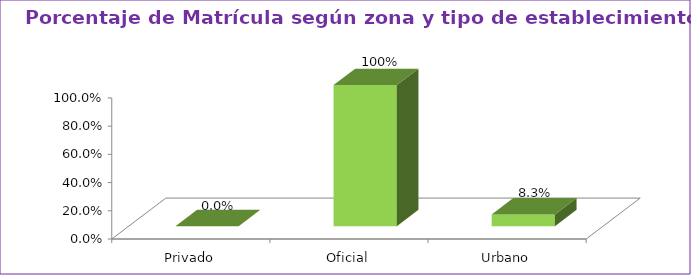
| Category | Series 1 |
|---|---|
| Privado | 0 |
| Oficial | 1 |
| Urbano | 0.083 |